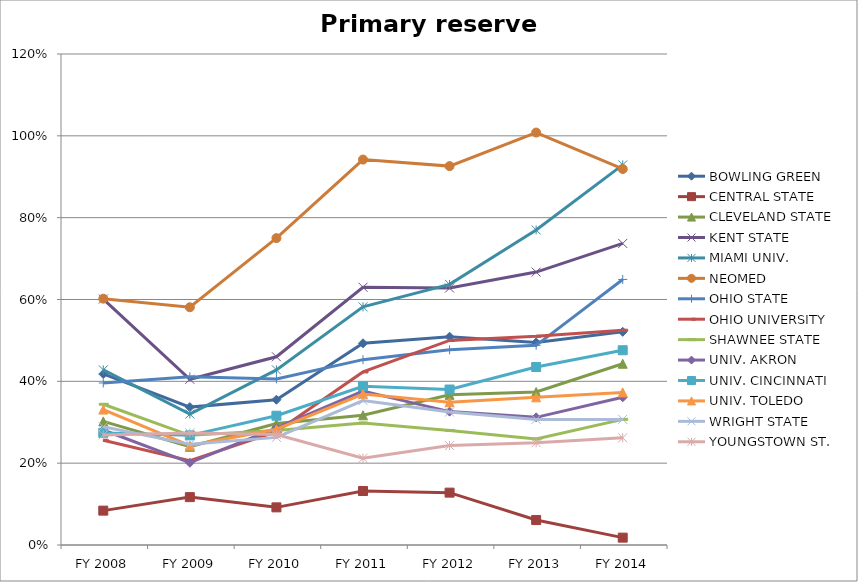
| Category | BOWLING GREEN  | CENTRAL STATE  | CLEVELAND STATE  | KENT STATE  | MIAMI UNIV.  | NEOMED  | OHIO STATE  | OHIO UNIVERSITY  | SHAWNEE STATE  | UNIV. AKRON  | UNIV. CINCINNATI  | UNIV. TOLEDO  | WRIGHT STATE  | YOUNGSTOWN ST.  |
|---|---|---|---|---|---|---|---|---|---|---|---|---|---|---|
| FY 2014 | 0.521 | 0.018 | 0.443 | 0.737 | 0.929 | 0.919 | 0.649 | 0.525 | 0.307 | 0.361 | 0.476 | 0.373 | 0.307 | 0.262 |
| FY 2013 | 0.495 | 0.061 | 0.374 | 0.667 | 0.77 | 1.008 | 0.488 | 0.51 | 0.259 | 0.312 | 0.435 | 0.361 | 0.307 | 0.25 |
| FY 2012 | 0.509 | 0.128 | 0.367 | 0.628 | 0.637 | 0.926 | 0.477 | 0.5 | 0.28 | 0.326 | 0.38 | 0.349 | 0.325 | 0.243 |
| FY 2011 | 0.493 | 0.132 | 0.317 | 0.63 | 0.582 | 0.942 | 0.453 | 0.423 | 0.298 | 0.376 | 0.388 | 0.369 | 0.353 | 0.212 |
| FY 2010 | 0.355 | 0.092 | 0.297 | 0.46 | 0.428 | 0.75 | 0.406 | 0.277 | 0.28 | 0.286 | 0.316 | 0.283 | 0.263 | 0.27 |
| FY 2009 | 0.337 | 0.117 | 0.24 | 0.405 | 0.32 | 0.581 | 0.411 | 0.206 | 0.268 | 0.201 | 0.268 | 0.243 | 0.246 | 0.274 |
| FY 2008 | 0.418 | 0.084 | 0.302 | 0.601 | 0.428 | 0.602 | 0.396 | 0.256 | 0.344 | 0.281 | 0.274 | 0.331 | 0.289 | 0.269 |